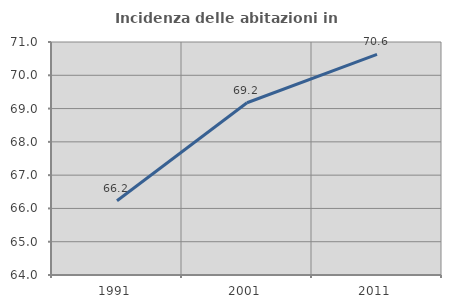
| Category | Incidenza delle abitazioni in proprietà  |
|---|---|
| 1991.0 | 66.23 |
| 2001.0 | 69.175 |
| 2011.0 | 70.627 |